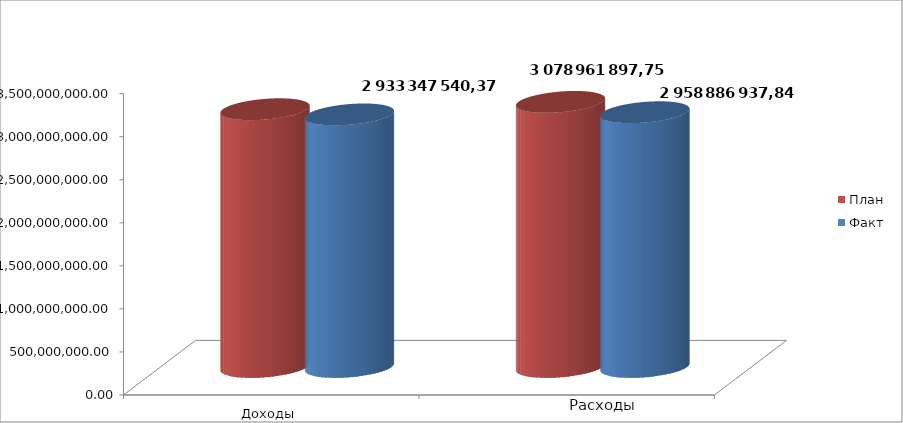
| Category | План | Факт |
|---|---|---|
| 0 | 2993772423.97 | 2933347540.37 |
| 1 | 3078961897.75 | 2958886937.84 |